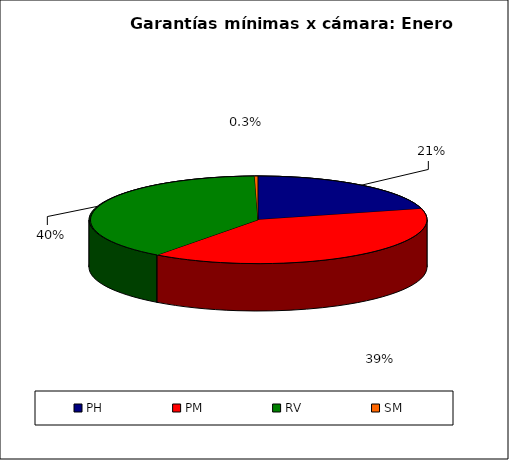
| Category | Series 0 |
|---|---|
| PH | 2449.094 |
| PM | 4577.883 |
| RV | 4612.429 |
| SM | 36.47 |